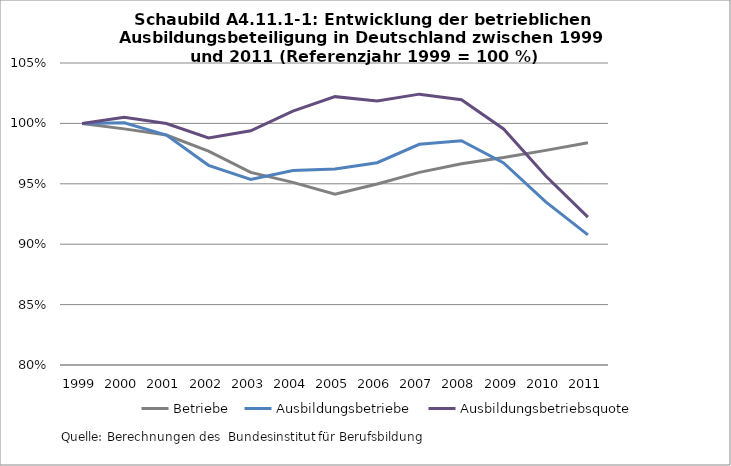
| Category | Betriebe | Ausbildungsbetriebe | Ausbildungsbetriebsquote |
|---|---|---|---|
| 1999.0 | 1 | 1 | 1 |
| 2000.0 | 0.995 | 1.001 | 1.005 |
| 2001.0 | 0.99 | 0.99 | 1 |
| 2002.0 | 0.977 | 0.965 | 0.988 |
| 2003.0 | 0.959 | 0.954 | 0.994 |
| 2004.0 | 0.951 | 0.961 | 1.01 |
| 2005.0 | 0.941 | 0.962 | 1.022 |
| 2006.0 | 0.95 | 0.967 | 1.019 |
| 2007.0 | 0.959 | 0.983 | 1.024 |
| 2008.0 | 0.967 | 0.986 | 1.02 |
| 2009.0 | 0.972 | 0.967 | 0.995 |
| 2010.0 | 0.978 | 0.935 | 0.956 |
| 2011.0 | 0.984 | 0.908 | 0.922 |